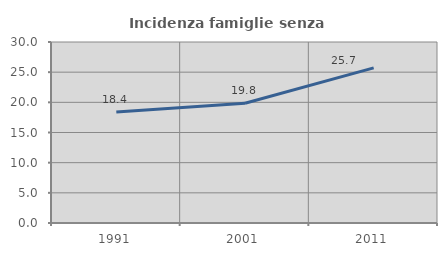
| Category | Incidenza famiglie senza nuclei |
|---|---|
| 1991.0 | 18.381 |
| 2001.0 | 19.837 |
| 2011.0 | 25.713 |